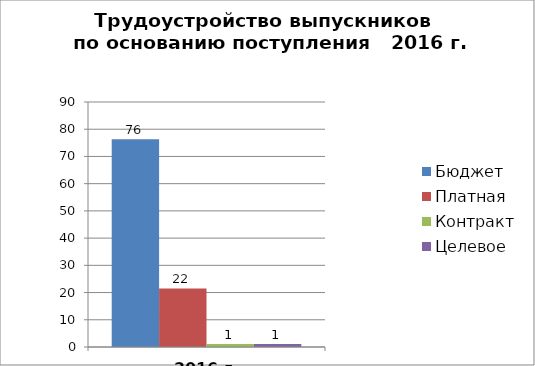
| Category | Бюджет | Платная | Контракт | Целевое |
|---|---|---|---|---|
| 2016 г. (%) | 76.344 | 21.505 | 1.075 | 1.075 |